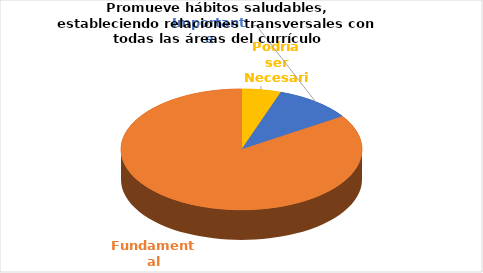
| Category | Series 0 |
|---|---|
| Podría ser Necesaria | 1 |
| Importante | 2 |
| Fundamental | 16 |